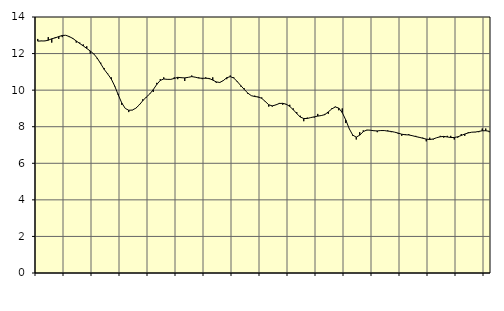
| Category | Piggar | Tillverkning av verkstadsvaror, SNI 25-30, 33 |
|---|---|---|
| nan | 12.8 | 12.68 |
| 87.0 | 12.7 | 12.69 |
| 87.0 | 12.7 | 12.69 |
| 87.0 | 12.9 | 12.73 |
| nan | 12.6 | 12.81 |
| 88.0 | 12.9 | 12.86 |
| 88.0 | 12.8 | 12.93 |
| 88.0 | 12.9 | 12.99 |
| nan | 13 | 13 |
| 89.0 | 12.9 | 12.93 |
| 89.0 | 12.8 | 12.83 |
| 89.0 | 12.6 | 12.69 |
| nan | 12.6 | 12.55 |
| 90.0 | 12.5 | 12.42 |
| 90.0 | 12.4 | 12.28 |
| 90.0 | 12 | 12.14 |
| nan | 12 | 11.98 |
| 91.0 | 11.7 | 11.75 |
| 91.0 | 11.5 | 11.44 |
| 91.0 | 11.2 | 11.13 |
| nan | 10.9 | 10.88 |
| 92.0 | 10.7 | 10.61 |
| 92.0 | 10.2 | 10.22 |
| 92.0 | 9.8 | 9.74 |
| nan | 9.2 | 9.3 |
| 93.0 | 9 | 9 |
| 93.0 | 8.8 | 8.9 |
| 93.0 | 8.9 | 8.91 |
| nan | 9 | 9.01 |
| 94.0 | 9.2 | 9.19 |
| 94.0 | 9.5 | 9.42 |
| 94.0 | 9.6 | 9.62 |
| nan | 9.8 | 9.79 |
| 95.0 | 9.9 | 10.03 |
| 95.0 | 10.4 | 10.31 |
| 95.0 | 10.6 | 10.53 |
| nan | 10.7 | 10.61 |
| 96.0 | 10.6 | 10.59 |
| 96.0 | 10.6 | 10.59 |
| 96.0 | 10.7 | 10.64 |
| nan | 10.6 | 10.7 |
| 97.0 | 10.7 | 10.68 |
| 97.0 | 10.5 | 10.67 |
| 97.0 | 10.7 | 10.7 |
| nan | 10.8 | 10.74 |
| 98.0 | 10.7 | 10.71 |
| 98.0 | 10.7 | 10.66 |
| 98.0 | 10.6 | 10.65 |
| nan | 10.7 | 10.65 |
| 99.0 | 10.6 | 10.64 |
| 99.0 | 10.7 | 10.55 |
| 99.0 | 10.4 | 10.45 |
| nan | 10.4 | 10.42 |
| 0.0 | 10.5 | 10.52 |
| 0.0 | 10.6 | 10.68 |
| 0.0 | 10.8 | 10.74 |
| nan | 10.7 | 10.66 |
| 1.0 | 10.5 | 10.47 |
| 1.0 | 10.2 | 10.25 |
| 1.0 | 10.1 | 10.04 |
| nan | 9.8 | 9.84 |
| 2.0 | 9.7 | 9.7 |
| 2.0 | 9.7 | 9.65 |
| 2.0 | 9.6 | 9.63 |
| nan | 9.6 | 9.55 |
| 3.0 | 9.4 | 9.38 |
| 3.0 | 9.1 | 9.2 |
| 3.0 | 9.1 | 9.14 |
| nan | 9.2 | 9.19 |
| 4.0 | 9.3 | 9.27 |
| 4.0 | 9.2 | 9.28 |
| 4.0 | 9.2 | 9.23 |
| nan | 9.2 | 9.11 |
| 5.0 | 9 | 8.93 |
| 5.0 | 8.8 | 8.72 |
| 5.0 | 8.6 | 8.53 |
| nan | 8.3 | 8.45 |
| 6.0 | 8.5 | 8.45 |
| 6.0 | 8.5 | 8.5 |
| 6.0 | 8.5 | 8.54 |
| nan | 8.7 | 8.58 |
| 7.0 | 8.6 | 8.61 |
| 7.0 | 8.7 | 8.66 |
| 7.0 | 8.7 | 8.81 |
| nan | 9 | 8.97 |
| 8.0 | 9.1 | 9.08 |
| 8.0 | 8.9 | 9.02 |
| 8.0 | 9 | 8.77 |
| nan | 8.2 | 8.37 |
| 9.0 | 7.9 | 7.89 |
| 9.0 | 7.5 | 7.54 |
| 9.0 | 7.3 | 7.43 |
| nan | 7.7 | 7.54 |
| 10.0 | 7.8 | 7.73 |
| 10.0 | 7.8 | 7.82 |
| 10.0 | 7.8 | 7.81 |
| nan | 7.8 | 7.78 |
| 11.0 | 7.7 | 7.77 |
| 11.0 | 7.8 | 7.79 |
| 11.0 | 7.8 | 7.79 |
| nan | 7.8 | 7.76 |
| 12.0 | 7.7 | 7.74 |
| 12.0 | 7.7 | 7.7 |
| 12.0 | 7.6 | 7.65 |
| nan | 7.5 | 7.59 |
| 13.0 | 7.6 | 7.56 |
| 13.0 | 7.6 | 7.55 |
| 13.0 | 7.5 | 7.51 |
| nan | 7.5 | 7.46 |
| 14.0 | 7.4 | 7.42 |
| 14.0 | 7.4 | 7.37 |
| 14.0 | 7.2 | 7.32 |
| nan | 7.4 | 7.3 |
| 15.0 | 7.3 | 7.33 |
| 15.0 | 7.4 | 7.4 |
| 15.0 | 7.5 | 7.45 |
| nan | 7.4 | 7.47 |
| 16.0 | 7.5 | 7.44 |
| 16.0 | 7.5 | 7.41 |
| 16.0 | 7.3 | 7.41 |
| nan | 7.4 | 7.45 |
| 17.0 | 7.6 | 7.52 |
| 17.0 | 7.5 | 7.6 |
| 17.0 | 7.7 | 7.66 |
| nan | 7.7 | 7.7 |
| 18.0 | 7.7 | 7.71 |
| 18.0 | 7.7 | 7.74 |
| 18.0 | 7.9 | 7.78 |
| nan | 7.9 | 7.78 |
| 19.0 | 7.7 | 7.75 |